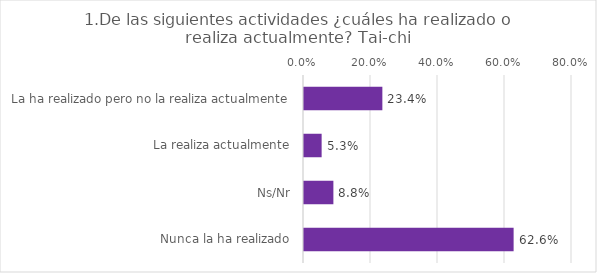
| Category | Series 0 |
|---|---|
| La ha realizado pero no la realiza actualmente | 0.234 |
| La realiza actualmente | 0.053 |
| Ns/Nr | 0.088 |
| Nunca la ha realizado | 0.626 |